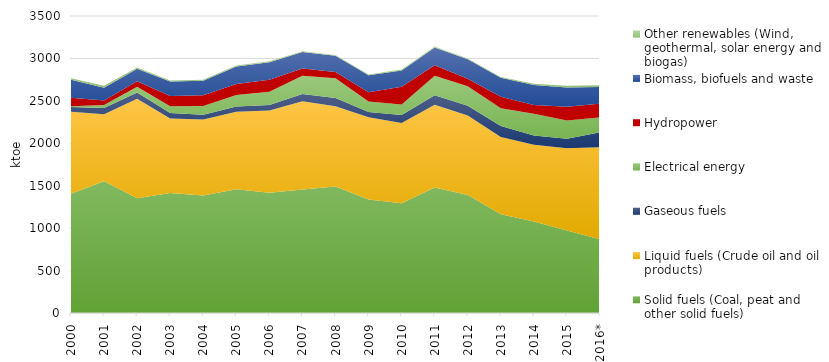
| Category | Solid fuels (Coal, peat and other solid fuels) | Liquid fuels (Crude oil and oil products) | Gaseous fuels  | Electrical energy | Hydropower | Biomass, biofuels and waste  | Other renewables (Wind, geothermal, solar energy and biogas) |
|---|---|---|---|---|---|---|---|
| 2000 | 1405.704 | 967.386 | 53.582 | 9.644 | 100.587 | 212.48 | 15.59 |
| 2001 | 1552.912 | 790.484 | 71.335 | 37.076 | 53.826 | 148.663 | 23.118 |
| 2002 | 1352.142 | 1172.972 | 73.748 | 68.018 | 65.099 | 146.914 | 12.962 |
| 2003 | 1415.107 | 876.086 | 64.675 | 81.953 | 118.117 | 170.998 | 13.153 |
| 2004 | 1385.356 | 895.179 | 56.914 | 101.115 | 127.404 | 170.852 | 11.75 |
| 2005 | 1458.817 | 911.638 | 62.512 | 137.498 | 128.245 | 206.457 | 10.047 |
| 2006 | 1417.616 | 967.863 | 66.946 | 154.326 | 141.812 | 206.861 | 10.356 |
| 2007 | 1454.66 | 1041.688 | 85.42 | 214.175 | 86.83 | 192 | 9.85 |
| 2008 | 1490.789 | 944.505 | 97.124 | 234.907 | 72.221 | 192.95 | 8.918 |
| 2009 | 1337.062 | 968.392 | 64.351 | 123.617 | 109.209 | 197.802 | 9.749 |
| 2010 | 1294.692 | 943.856 | 95.317 | 122.094 | 209.029 | 193.418 | 11.352 |
| 2011 | 1478.639 | 976.932 | 110.277 | 230.064 | 123.202 | 208.606 | 12.038 |
| 2012 | 1391.827 | 936.54 | 114.432 | 229.476 | 89.473 | 227.109 | 10.532 |
| 2013 | 1164.262 | 910.843 | 129.544 | 208.752 | 136.17 | 223.603 | 8.732 |
| 2014 | 1077.282 | 904.416 | 111.135 | 254.45 | 103.733 | 235.341 | 14.15 |
| 2015 | 971.326 | 969.937 | 111.948 | 216.03 | 160.347 | 228.433 | 20.149 |
| 2016* | 869.824 | 1084.606 | 176.039 | 174.58 | 163.111 | 196.706 | 20.329 |